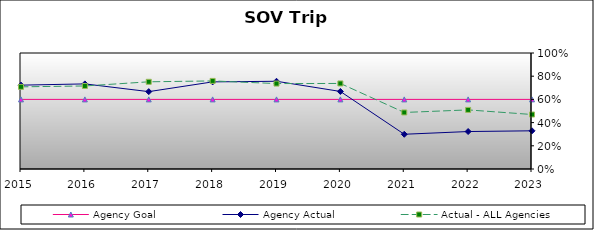
| Category | Agency Goal | Agency Actual | Actual - ALL Agencies |
|---|---|---|---|
| 2015.0 | 0.6 | 0.723 | 0.708 |
| 2016.0 | 0.6 | 0.734 | 0.716 |
| 2017.0 | 0.6 | 0.667 | 0.752 |
| 2018.0 | 0.6 | 0.751 | 0.759 |
| 2019.0 | 0.6 | 0.756 | 0.736 |
| 2020.0 | 0.6 | 0.668 | 0.737 |
| 2021.0 | 0.6 | 0.3 | 0.487 |
| 2022.0 | 0.6 | 0.323 | 0.509 |
| 2023.0 | 0.6 | 0.329 | 0.47 |